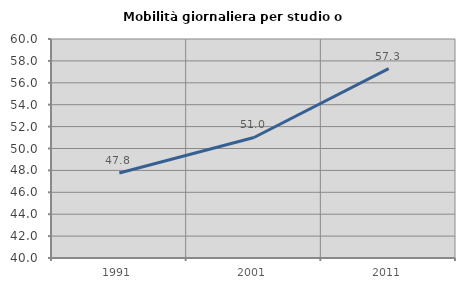
| Category | Mobilità giornaliera per studio o lavoro |
|---|---|
| 1991.0 | 47.766 |
| 2001.0 | 51.008 |
| 2011.0 | 57.292 |